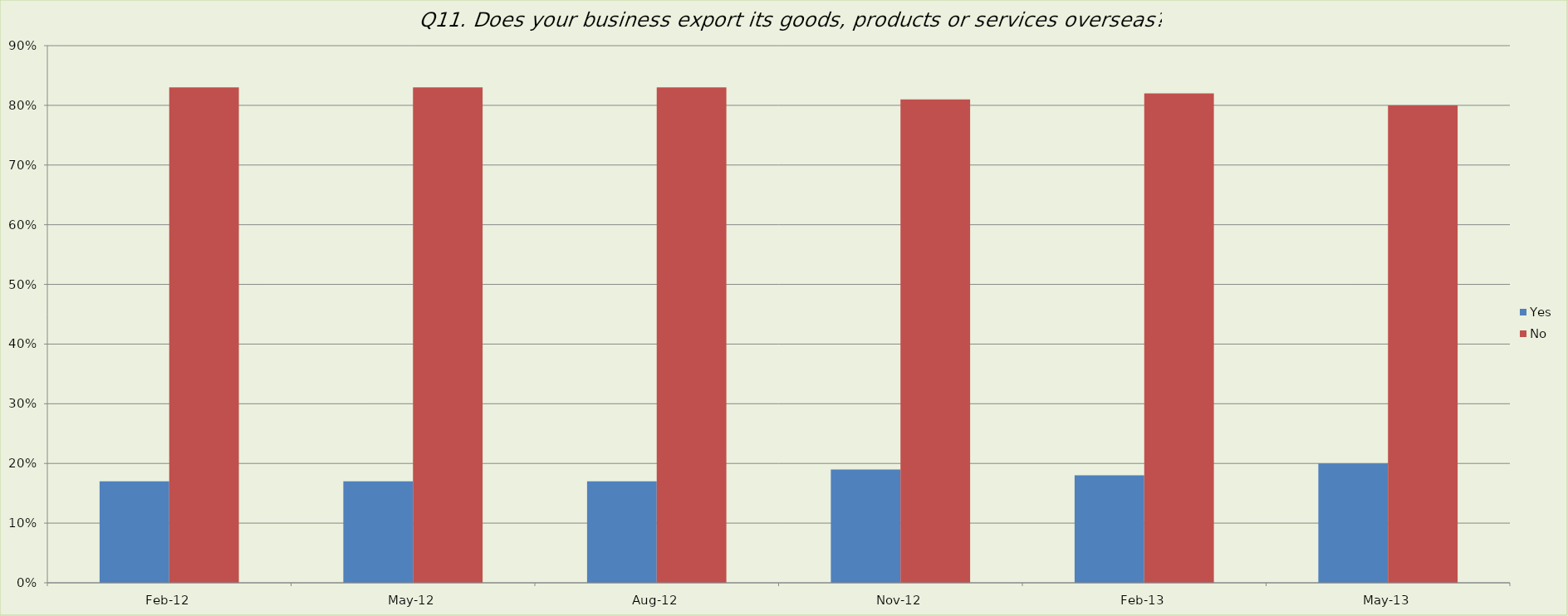
| Category | Yes | No |
|---|---|---|
| 2012-02-01 | 0.17 | 0.83 |
| 2012-05-01 | 0.17 | 0.83 |
| 2012-08-01 | 0.17 | 0.83 |
| 2012-11-01 | 0.19 | 0.81 |
| 2013-02-01 | 0.18 | 0.82 |
| 2013-05-01 | 0.2 | 0.8 |